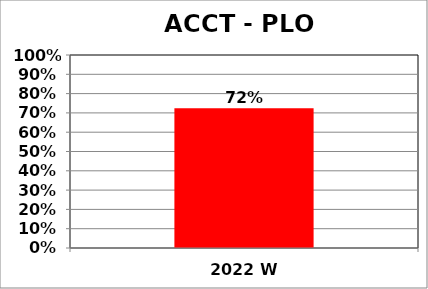
| Category | Series 0 |
|---|---|
| 2022 W | 0.724 |